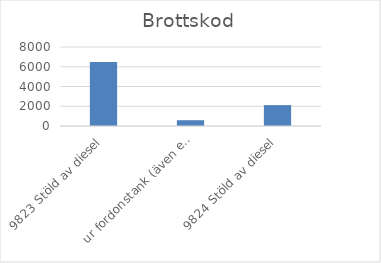
| Category | Summa |
|---|---|
| 9823 Stöld av diesel, ur fordonstank (även entreprenadmaskin m.m.) | 6474 |
| 9824 Stöld av diesel, ur större tankar (ej kopplade till fordon) | 586 |
| 9825 Stöld av drivmedel (även diesel), ej genom smitning | 2117 |